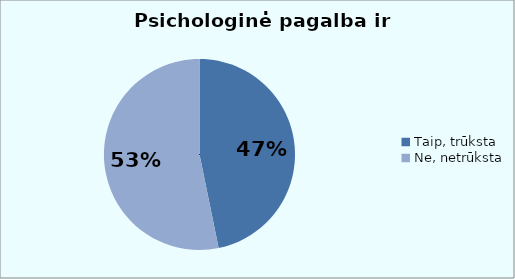
| Category | Series 0 |
|---|---|
| Taip, trūksta | 51 |
| Ne, netrūksta | 58 |